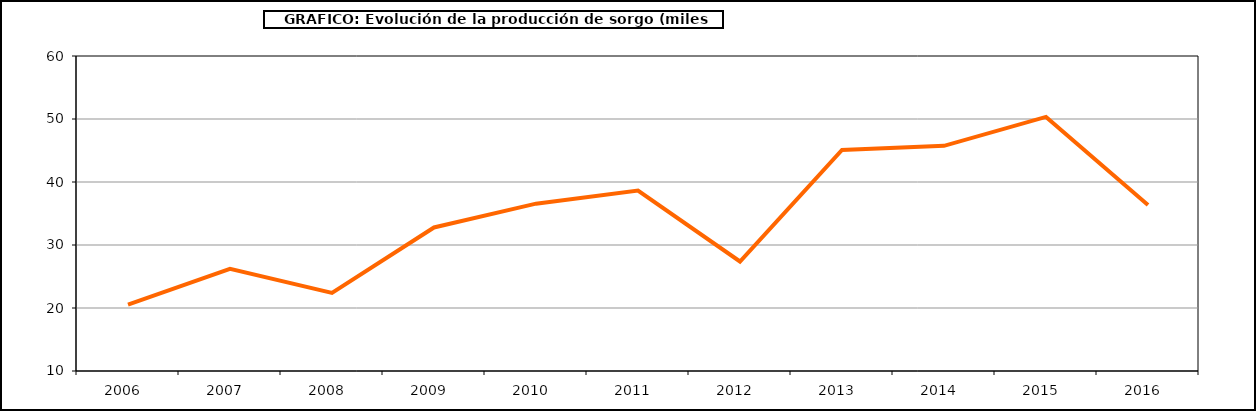
| Category | Producción |
|---|---|
| 2006.0 | 20.519 |
| 2007.0 | 26.21 |
| 2008.0 | 22.397 |
| 2009.0 | 32.782 |
| 2010.0 | 36.561 |
| 2011.0 | 38.643 |
| 2012.0 | 27.38 |
| 2013.0 | 45.085 |
| 2014.0 | 45.744 |
| 2015.0 | 50.335 |
| 2016.0 | 36.361 |